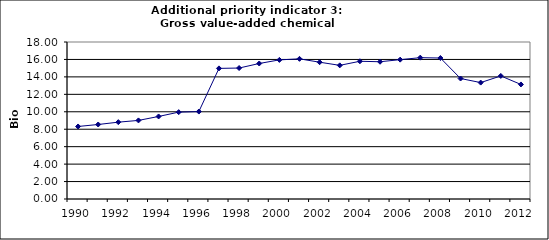
| Category | Gross value-added chemical industry, Bio Euro (EC95) |
|---|---|
| 1990 | 8.315 |
| 1991 | 8.542 |
| 1992 | 8.809 |
| 1993 | 9.009 |
| 1994 | 9.463 |
| 1995 | 9.957 |
| 1996 | 10.024 |
| 1997 | 14.975 |
| 1998 | 15.015 |
| 1999 | 15.536 |
| 2000 | 15.95 |
| 2001 | 16.07 |
| 2002 | 15.683 |
| 2003 | 15.322 |
| 2004 | 15.789 |
| 2005 | 15.736 |
| 2006 | 15.976 |
| 2007 | 16.203 |
| 2008 | 16.163 |
| 2009 | 13.814 |
| 2010 | 13.347 |
| 2011 | 14.108 |
| 2012 | 13.133 |